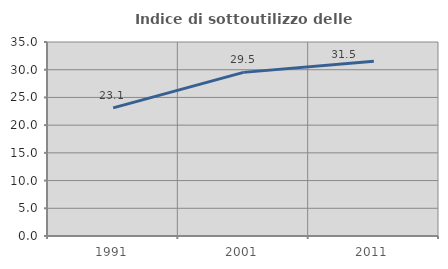
| Category | Indice di sottoutilizzo delle abitazioni  |
|---|---|
| 1991.0 | 23.111 |
| 2001.0 | 29.519 |
| 2011.0 | 31.507 |